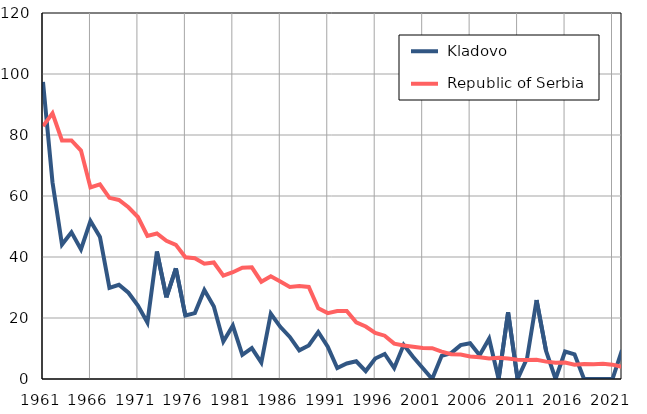
| Category |  Kladovo |  Republic of Serbia |
|---|---|---|
| 1961.0 | 97.4 | 82.9 |
| 1962.0 | 64.5 | 87.1 |
| 1963.0 | 44.1 | 78.2 |
| 1964.0 | 48.1 | 78.2 |
| 1965.0 | 42.5 | 74.9 |
| 1966.0 | 51.8 | 62.8 |
| 1967.0 | 46.6 | 63.8 |
| 1968.0 | 29.9 | 59.4 |
| 1969.0 | 30.9 | 58.7 |
| 1970.0 | 28.3 | 56.3 |
| 1971.0 | 24.1 | 53.1 |
| 1972.0 | 18.5 | 46.9 |
| 1973.0 | 41.8 | 47.7 |
| 1974.0 | 26.8 | 45.3 |
| 1975.0 | 36.3 | 44 |
| 1976.0 | 20.8 | 39.9 |
| 1977.0 | 21.6 | 39.6 |
| 1978.0 | 29.2 | 37.8 |
| 1979.0 | 23.8 | 38.2 |
| 1980.0 | 12.3 | 33.9 |
| 1981.0 | 17.5 | 35 |
| 1982.0 | 7.9 | 36.5 |
| 1983.0 | 10.1 | 36.6 |
| 1984.0 | 5.4 | 31.9 |
| 1985.0 | 21.4 | 33.7 |
| 1986.0 | 17.1 | 32 |
| 1987.0 | 13.8 | 30.2 |
| 1988.0 | 9.4 | 30.5 |
| 1989.0 | 11 | 30.2 |
| 1990.0 | 15.4 | 23.2 |
| 1991.0 | 10.6 | 21.6 |
| 1992.0 | 3.6 | 22.3 |
| 1993.0 | 5.1 | 22.3 |
| 1994.0 | 5.8 | 18.6 |
| 1995.0 | 2.6 | 17.2 |
| 1996.0 | 6.7 | 15.1 |
| 1997.0 | 8.2 | 14.2 |
| 1998.0 | 3.6 | 11.6 |
| 1999.0 | 11.2 | 11 |
| 2000.0 | 7.2 | 10.6 |
| 2001.0 | 3.6 | 10.2 |
| 2002.0 | 0 | 10.1 |
| 2003.0 | 7.6 | 9 |
| 2004.0 | 8.5 | 8.1 |
| 2005.0 | 11.1 | 8 |
| 2006.0 | 11.7 | 7.4 |
| 2007.0 | 7.8 | 7.1 |
| 2008.0 | 13.2 | 6.7 |
| 2009.0 | 0 | 7 |
| 2010.0 | 21.9 | 6.7 |
| 2011.0 | 0 | 6.3 |
| 2012.0 | 6.8 | 6.2 |
| 2013.0 | 25.9 | 6.3 |
| 2014.0 | 9.2 | 5.7 |
| 2015.0 | 0 | 5.3 |
| 2016.0 | 9 | 5.4 |
| 2017.0 | 8.1 | 4.7 |
| 2018.0 | 0 | 4.9 |
| 2019.0 | 0 | 4.8 |
| 2020.0 | 0 | 5 |
| 2021.0 | 0 | 4.7 |
| 2022.0 | 9.5 | 4 |